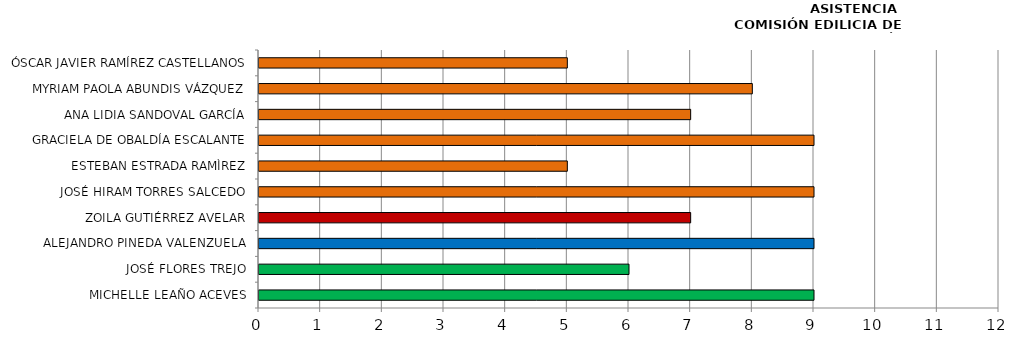
| Category | Series 0 |
|---|---|
| MICHELLE LEAÑO ACEVES | 9 |
| JOSÉ FLORES TREJO | 6 |
| ALEJANDRO PINEDA VALENZUELA | 9 |
| ZOILA GUTIÉRREZ AVELAR | 7 |
| JOSÉ HIRAM TORRES SALCEDO | 9 |
| ESTEBAN ESTRADA RAMÌREZ | 5 |
| GRACIELA DE OBALDÍA ESCALANTE | 9 |
| ANA LIDIA SANDOVAL GARCÍA | 7 |
| MYRIAM PAOLA ABUNDIS VÁZQUEZ | 8 |
| ÓSCAR JAVIER RAMÍREZ CASTELLANOS | 5 |